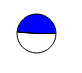
| Category | Series 0 |
|---|---|
| 0 | 44918 |
| 1 | 42745 |